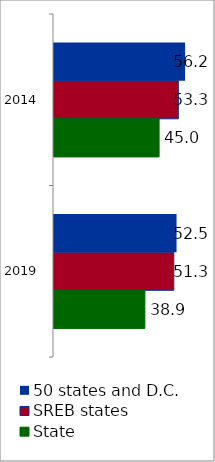
| Category | 50 states and D.C. | SREB states | State |
|---|---|---|---|
| 2014.0 | 56.179 | 53.294 | 45.04 |
| 2019.0 | 52.52 | 51.342 | 38.943 |